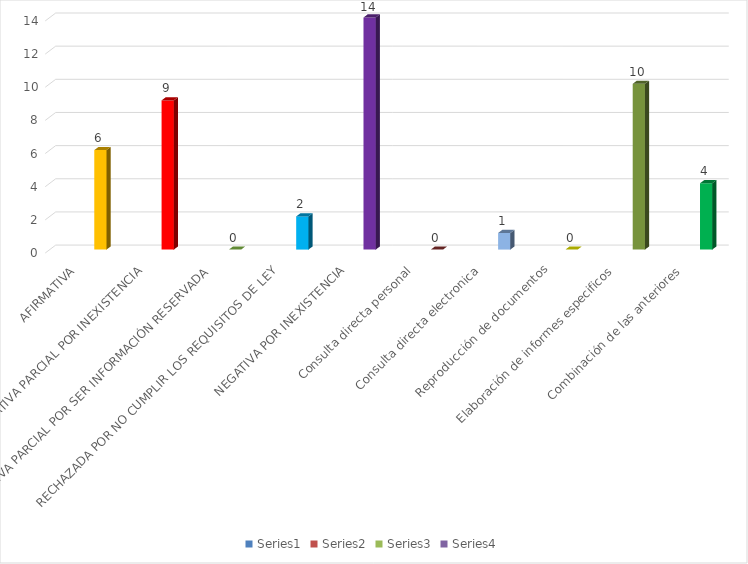
| Category | Series 0 | Series 1 | Series 2 | Series 3 |
|---|---|---|---|---|
| AFIRMATIVA |  |  |  | 6 |
| AFIRMATIVA PARCIAL POR INEXISTENCIA |  |  |  | 9 |
| AFIRMATIVA PARCIAL POR SER INFORMACIÓN RESERVADA |  |  |  | 0 |
| RECHAZADA POR NO CUMPLIR LOS REQUISITOS DE LEY |  |  |  | 2 |
| NEGATIVA POR INEXISTENCIA |  |  |  | 14 |
| Consulta directa personal |  |  |  | 0 |
| Consulta directa electronica |  |  |  | 1 |
| Reproducción de documentos |  |  |  | 0 |
| Elaboración de informes especificos |  |  |  | 10 |
| Combinación de las anteriores |  |  |  | 4 |